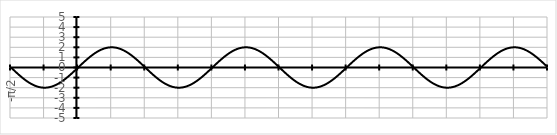
| Category | Series 0 |
|---|---|
| -π/2 | 0 |
|  | -0.07 |
|  | -0.14 |
|  | -0.209 |
|  | -0.278 |
|  | -0.347 |
|  | -0.416 |
|  | -0.484 |
|  | -0.551 |
|  | -0.618 |
|  | -0.684 |
|  | -0.749 |
|  | -0.813 |
|  | -0.877 |
|  | -0.939 |
|  | -1 |
|  | -1.06 |
|  | -1.118 |
|  | -1.176 |
|  | -1.231 |
|  | -1.286 |
|  | -1.338 |
|  | -1.389 |
|  | -1.439 |
|  | -1.486 |
|  | -1.532 |
|  | -1.576 |
|  | -1.618 |
|  | -1.658 |
|  | -1.696 |
|  | -1.732 |
|  | -1.766 |
|  | -1.798 |
|  | -1.827 |
|  | -1.854 |
|  | -1.879 |
|  | -1.902 |
|  | -1.923 |
|  | -1.941 |
|  | -1.956 |
|  | -1.97 |
|  | -1.981 |
|  | -1.989 |
|  | -1.995 |
|  | -1.999 |
|   | -2 |
|  | -1.999 |
|  | -1.995 |
|  | -1.989 |
|  | -1.981 |
|  | -1.97 |
|  | -1.956 |
|  | -1.941 |
|  | -1.923 |
|  | -1.902 |
|  | -1.879 |
|  | -1.854 |
|  | -1.827 |
|  | -1.798 |
|  | -1.766 |
|  | -1.732 |
|  | -1.696 |
|  | -1.658 |
|  | -1.618 |
|  | -1.576 |
|  | -1.532 |
|  | -1.486 |
|  | -1.439 |
|  | -1.389 |
|  | -1.338 |
|  | -1.286 |
|  | -1.231 |
|  | -1.176 |
|  | -1.118 |
|  | -1.06 |
|  | -1 |
|  | -0.939 |
|  | -0.877 |
|  | -0.813 |
|  | -0.749 |
|  | -0.684 |
|  | -0.618 |
|  | -0.551 |
|  | -0.484 |
|  | -0.416 |
|  | -0.347 |
|  | -0.278 |
|  | -0.209 |
|  | -0.14 |
|  | -0.07 |
| 0 | 0 |
|  | 0.07 |
|  | 0.14 |
|  | 0.209 |
|  | 0.278 |
|  | 0.347 |
|  | 0.416 |
|  | 0.484 |
|  | 0.551 |
|  | 0.618 |
|  | 0.684 |
|  | 0.749 |
|  | 0.813 |
|  | 0.877 |
|  | 0.939 |
|  | 1 |
|  | 1.06 |
|  | 1.118 |
|  | 1.176 |
|  | 1.231 |
|  | 1.286 |
|  | 1.338 |
|  | 1.389 |
|  | 1.439 |
|  | 1.486 |
|  | 1.532 |
|  | 1.576 |
|  | 1.618 |
|  | 1.658 |
|  | 1.696 |
|  | 1.732 |
|  | 1.766 |
|  | 1.798 |
|  | 1.827 |
|  | 1.854 |
|  | 1.879 |
|  | 1.902 |
|  | 1.923 |
|  | 1.941 |
|  | 1.956 |
|  | 1.97 |
|  | 1.981 |
|  | 1.989 |
|  | 1.995 |
|  | 1.999 |
|   | 2 |
|  | 1.999 |
|  | 1.995 |
|  | 1.989 |
|  | 1.981 |
|  | 1.97 |
|  | 1.956 |
|  | 1.941 |
|  | 1.923 |
|  | 1.902 |
|  | 1.879 |
|  | 1.854 |
|  | 1.827 |
|  | 1.798 |
|  | 1.766 |
|  | 1.732 |
|  | 1.696 |
|  | 1.658 |
|  | 1.618 |
|  | 1.576 |
|  | 1.532 |
|  | 1.486 |
|  | 1.439 |
|  | 1.389 |
|  | 1.338 |
|  | 1.286 |
|  | 1.231 |
|  | 1.176 |
|  | 1.118 |
|  | 1.06 |
|  | 1 |
|  | 0.939 |
|  | 0.877 |
|  | 0.813 |
|  | 0.749 |
|  | 0.684 |
|  | 0.618 |
|  | 0.551 |
|  | 0.484 |
|  | 0.416 |
|  | 0.347 |
|  | 0.278 |
|  | 0.209 |
|  | 0.14 |
|  | 0.07 |
| π/2 | 0 |
|  | -0.07 |
|  | -0.14 |
|  | -0.209 |
|  | -0.278 |
|  | -0.347 |
|  | -0.416 |
|  | -0.484 |
|  | -0.551 |
|  | -0.618 |
|  | -0.684 |
|  | -0.749 |
|  | -0.813 |
|  | -0.877 |
|  | -0.939 |
|  | -1 |
|  | -1.06 |
|  | -1.118 |
|  | -1.176 |
|  | -1.231 |
|  | -1.286 |
|  | -1.338 |
|  | -1.389 |
|  | -1.439 |
|  | -1.486 |
|  | -1.532 |
|  | -1.576 |
|  | -1.618 |
|  | -1.658 |
|  | -1.696 |
|  | -1.732 |
|  | -1.766 |
|  | -1.798 |
|  | -1.827 |
|  | -1.854 |
|  | -1.879 |
|  | -1.902 |
|  | -1.923 |
|  | -1.941 |
|  | -1.956 |
|  | -1.97 |
|  | -1.981 |
|  | -1.989 |
|  | -1.995 |
|  | -1.999 |
|   | -2 |
|  | -1.999 |
|  | -1.995 |
|  | -1.989 |
|  | -1.981 |
|  | -1.97 |
|  | -1.956 |
|  | -1.941 |
|  | -1.923 |
|  | -1.902 |
|  | -1.879 |
|  | -1.854 |
|  | -1.827 |
|  | -1.798 |
|  | -1.766 |
|  | -1.732 |
|  | -1.696 |
|  | -1.658 |
|  | -1.618 |
|  | -1.576 |
|  | -1.532 |
|  | -1.486 |
|  | -1.439 |
|  | -1.389 |
|  | -1.338 |
|  | -1.286 |
|  | -1.231 |
|  | -1.176 |
|  | -1.118 |
|  | -1.06 |
|  | -1 |
|  | -0.939 |
|  | -0.877 |
|  | -0.813 |
|  | -0.749 |
|  | -0.684 |
|  | -0.618 |
|  | -0.551 |
|  | -0.484 |
|  | -0.416 |
|  | -0.347 |
|  | -0.278 |
|  | -0.209 |
|  | -0.14 |
|  | -0.07 |
| π | 0 |
|  | 0.07 |
|  | 0.14 |
|  | 0.209 |
|  | 0.278 |
|  | 0.347 |
|  | 0.416 |
|  | 0.484 |
|  | 0.551 |
|  | 0.618 |
|  | 0.684 |
|  | 0.749 |
|  | 0.813 |
|  | 0.877 |
|  | 0.939 |
|  | 1 |
|  | 1.06 |
|  | 1.118 |
|  | 1.176 |
|  | 1.231 |
|  | 1.286 |
|  | 1.338 |
|  | 1.389 |
|  | 1.439 |
|  | 1.486 |
|  | 1.532 |
|  | 1.576 |
|  | 1.618 |
|  | 1.658 |
|  | 1.696 |
|  | 1.732 |
|  | 1.766 |
|  | 1.798 |
|  | 1.827 |
|  | 1.854 |
|  | 1.879 |
|  | 1.902 |
|  | 1.923 |
|  | 1.941 |
|  | 1.956 |
|  | 1.97 |
|  | 1.981 |
|  | 1.989 |
|  | 1.995 |
|  | 1.999 |
|   | 2 |
|  | 1.999 |
|  | 1.995 |
|  | 1.989 |
|  | 1.981 |
|  | 1.97 |
|  | 1.956 |
|  | 1.941 |
|  | 1.923 |
|  | 1.902 |
|  | 1.879 |
|  | 1.854 |
|  | 1.827 |
|  | 1.798 |
|  | 1.766 |
|  | 1.732 |
|  | 1.696 |
|  | 1.658 |
|  | 1.618 |
|  | 1.576 |
|  | 1.532 |
|  | 1.486 |
|  | 1.439 |
|  | 1.389 |
|  | 1.338 |
|  | 1.286 |
|  | 1.231 |
|  | 1.176 |
|  | 1.118 |
|  | 1.06 |
|  | 1 |
|  | 0.939 |
|  | 0.877 |
|  | 0.813 |
|  | 0.749 |
|  | 0.684 |
|  | 0.618 |
|  | 0.551 |
|  | 0.484 |
|  | 0.416 |
|  | 0.347 |
|  | 0.278 |
|  | 0.209 |
|  | 0.14 |
|  | 0.07 |
| 3π/2 | 0 |
|  | -0.07 |
|  | -0.14 |
|  | -0.209 |
|  | -0.278 |
|  | -0.347 |
|  | -0.416 |
|  | -0.484 |
|  | -0.551 |
|  | -0.618 |
|  | -0.684 |
|  | -0.749 |
|  | -0.813 |
|  | -0.877 |
|  | -0.939 |
|  | -1 |
|  | -1.06 |
|  | -1.118 |
|  | -1.176 |
|  | -1.231 |
|  | -1.286 |
|  | -1.338 |
|  | -1.389 |
|  | -1.439 |
|  | -1.486 |
|  | -1.532 |
|  | -1.576 |
|  | -1.618 |
|  | -1.658 |
|  | -1.696 |
|  | -1.732 |
|  | -1.766 |
|  | -1.798 |
|  | -1.827 |
|  | -1.854 |
|  | -1.879 |
|  | -1.902 |
|  | -1.923 |
|  | -1.941 |
|  | -1.956 |
|  | -1.97 |
|  | -1.981 |
|  | -1.989 |
|  | -1.995 |
|  | -1.999 |
|   | -2 |
|  | -1.999 |
|  | -1.995 |
|  | -1.989 |
|  | -1.981 |
|  | -1.97 |
|  | -1.956 |
|  | -1.941 |
|  | -1.923 |
|  | -1.902 |
|  | -1.879 |
|  | -1.854 |
|  | -1.827 |
|  | -1.798 |
|  | -1.766 |
|  | -1.732 |
|  | -1.696 |
|  | -1.658 |
|  | -1.618 |
|  | -1.576 |
|  | -1.532 |
|  | -1.486 |
|  | -1.439 |
|  | -1.389 |
|  | -1.338 |
|  | -1.286 |
|  | -1.231 |
|  | -1.176 |
|  | -1.118 |
|  | -1.06 |
|  | -1 |
|  | -0.939 |
|  | -0.877 |
|  | -0.813 |
|  | -0.749 |
|  | -0.684 |
|  | -0.618 |
|  | -0.551 |
|  | -0.484 |
|  | -0.416 |
|  | -0.347 |
|  | -0.278 |
|  | -0.209 |
|  | -0.14 |
|  | -0.07 |
| 2π | 0 |
|  | 0.07 |
|  | 0.14 |
|  | 0.209 |
|  | 0.278 |
|  | 0.347 |
|  | 0.416 |
|  | 0.484 |
|  | 0.551 |
|  | 0.618 |
|  | 0.684 |
|  | 0.749 |
|  | 0.813 |
|  | 0.877 |
|  | 0.939 |
|  | 1 |
|  | 1.06 |
|  | 1.118 |
|  | 1.176 |
|  | 1.231 |
|  | 1.286 |
|  | 1.338 |
|  | 1.389 |
|  | 1.439 |
|  | 1.486 |
|  | 1.532 |
|  | 1.576 |
|  | 1.618 |
|  | 1.658 |
|  | 1.696 |
|  | 1.732 |
|  | 1.766 |
|  | 1.798 |
|  | 1.827 |
|  | 1.854 |
|  | 1.879 |
|  | 1.902 |
|  | 1.923 |
|  | 1.941 |
|  | 1.956 |
|  | 1.97 |
|  | 1.981 |
|  | 1.989 |
|  | 1.995 |
|  | 1.999 |
|   | 2 |
|  | 1.999 |
|  | 1.995 |
|  | 1.989 |
|  | 1.981 |
|  | 1.97 |
|  | 1.956 |
|  | 1.941 |
|  | 1.923 |
|  | 1.902 |
|  | 1.879 |
|  | 1.854 |
|  | 1.827 |
|  | 1.798 |
|  | 1.766 |
|  | 1.732 |
|  | 1.696 |
|  | 1.658 |
|  | 1.618 |
|  | 1.576 |
|  | 1.532 |
|  | 1.486 |
|  | 1.439 |
|  | 1.389 |
|  | 1.338 |
|  | 1.286 |
|  | 1.231 |
|  | 1.176 |
|  | 1.118 |
|  | 1.06 |
|  | 1 |
|  | 0.939 |
|  | 0.877 |
|  | 0.813 |
|  | 0.749 |
|  | 0.684 |
|  | 0.618 |
|  | 0.551 |
|  | 0.484 |
|  | 0.416 |
|  | 0.347 |
|  | 0.278 |
|  | 0.209 |
|  | 0.14 |
|  | 0.07 |
| 5π/2 | 0 |
|  | -0.07 |
|  | -0.14 |
|  | -0.209 |
|  | -0.278 |
|  | -0.347 |
|  | -0.416 |
|  | -0.484 |
|  | -0.551 |
|  | -0.618 |
|  | -0.684 |
|  | -0.749 |
|  | -0.813 |
|  | -0.877 |
|  | -0.939 |
|  | -1 |
|  | -1.06 |
|  | -1.118 |
|  | -1.176 |
|  | -1.231 |
|  | -1.286 |
|  | -1.338 |
|  | -1.389 |
|  | -1.439 |
|  | -1.486 |
|  | -1.532 |
|  | -1.576 |
|  | -1.618 |
|  | -1.658 |
|  | -1.696 |
|  | -1.732 |
|  | -1.766 |
|  | -1.798 |
|  | -1.827 |
|  | -1.854 |
|  | -1.879 |
|  | -1.902 |
|  | -1.923 |
|  | -1.941 |
|  | -1.956 |
|  | -1.97 |
|  | -1.981 |
|  | -1.989 |
|  | -1.995 |
|  | -1.999 |
|   | -2 |
|  | -1.999 |
|  | -1.995 |
|  | -1.989 |
|  | -1.981 |
|  | -1.97 |
|  | -1.956 |
|  | -1.941 |
|  | -1.923 |
|  | -1.902 |
|  | -1.879 |
|  | -1.854 |
|  | -1.827 |
|  | -1.798 |
|  | -1.766 |
|  | -1.732 |
|  | -1.696 |
|  | -1.658 |
|  | -1.618 |
|  | -1.576 |
|  | -1.532 |
|  | -1.486 |
|  | -1.439 |
|  | -1.389 |
|  | -1.338 |
|  | -1.286 |
|  | -1.231 |
|  | -1.176 |
|  | -1.118 |
|  | -1.06 |
|  | -1 |
|  | -0.939 |
|  | -0.877 |
|  | -0.813 |
|  | -0.749 |
|  | -0.684 |
|  | -0.618 |
|  | -0.551 |
|  | -0.484 |
|  | -0.416 |
|  | -0.347 |
|  | -0.278 |
|  | -0.209 |
|  | -0.14 |
|  | -0.07 |
| 3π | 0 |
|  | 0.07 |
|  | 0.14 |
|  | 0.209 |
|  | 0.278 |
|  | 0.347 |
|  | 0.416 |
|  | 0.484 |
|  | 0.551 |
|  | 0.618 |
|  | 0.684 |
|  | 0.749 |
|  | 0.813 |
|  | 0.877 |
|  | 0.939 |
|  | 1 |
|  | 1.06 |
|  | 1.118 |
|  | 1.176 |
|  | 1.231 |
|  | 1.286 |
|  | 1.338 |
|  | 1.389 |
|  | 1.439 |
|  | 1.486 |
|  | 1.532 |
|  | 1.576 |
|  | 1.618 |
|  | 1.658 |
|  | 1.696 |
|  | 1.732 |
|  | 1.766 |
|  | 1.798 |
|  | 1.827 |
|  | 1.854 |
|  | 1.879 |
|  | 1.902 |
|  | 1.923 |
|  | 1.941 |
|  | 1.956 |
|  | 1.97 |
|  | 1.981 |
|  | 1.989 |
|  | 1.995 |
|  | 1.999 |
|   | 2 |
|  | 1.999 |
|  | 1.995 |
|  | 1.989 |
|  | 1.981 |
|  | 1.97 |
|  | 1.956 |
|  | 1.941 |
|  | 1.923 |
|  | 1.902 |
|  | 1.879 |
|  | 1.854 |
|  | 1.827 |
|  | 1.798 |
|  | 1.766 |
|  | 1.732 |
|  | 1.696 |
|  | 1.658 |
|  | 1.618 |
|  | 1.576 |
|  | 1.532 |
|  | 1.486 |
|  | 1.439 |
|  | 1.389 |
|  | 1.338 |
|  | 1.286 |
|  | 1.231 |
|  | 1.176 |
|  | 1.118 |
|  | 1.06 |
|  | 1 |
|  | 0.939 |
|  | 0.877 |
|  | 0.813 |
|  | 0.749 |
|  | 0.684 |
|  | 0.618 |
|  | 0.551 |
|  | 0.484 |
|  | 0.416 |
|  | 0.347 |
|  | 0.278 |
|  | 0.209 |
|  | 0.14 |
|  | 0.07 |
| 7π/2 | 0 |